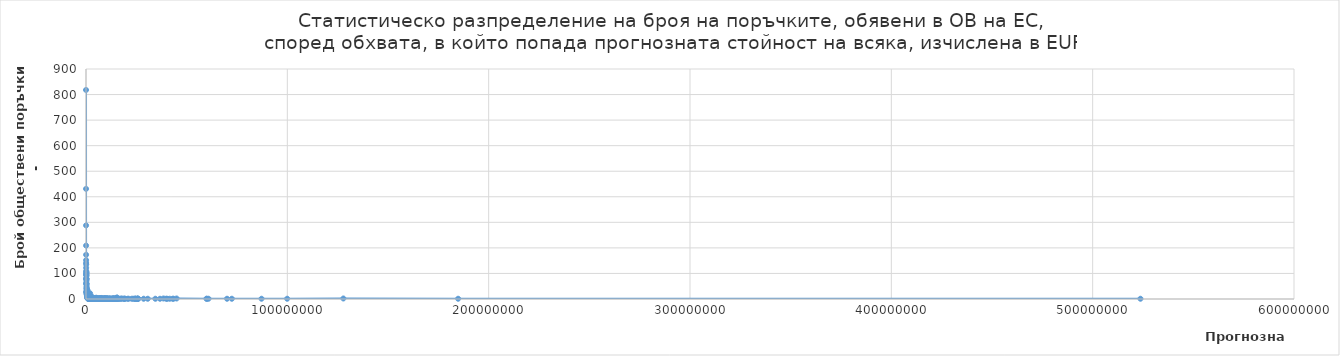
| Category | Series 0 |
|---|---|
| 10000.0 | 818 |
| 20000.0 | 431 |
| 30000.0 | 288 |
| 40000.0 | 209 |
| 50000.0 | 173 |
| 60000.0 | 152 |
| 70000.0 | 141 |
| 80000.0 | 122 |
| 90000.0 | 94 |
| 100000.0 | 110 |
| 110000.0 | 135 |
| 120000.0 | 62 |
| 130000.0 | 99 |
| 140000.0 | 81 |
| 150000.0 | 79 |
| 160000.0 | 104 |
| 170000.0 | 96 |
| 180000.0 | 61 |
| 190000.0 | 79 |
| 200000.0 | 71 |
| 210000.0 | 104 |
| 220000.0 | 59 |
| 230000.0 | 44 |
| 240000.0 | 77 |
| 250000.0 | 57 |
| 260000.0 | 91 |
| 270000.0 | 38 |
| 280000.0 | 32 |
| 290000.0 | 27 |
| 300000.0 | 19 |
| 310000.0 | 49 |
| 320000.0 | 28 |
| 330000.0 | 25 |
| 340000.0 | 27 |
| 350000.0 | 21 |
| 360000.0 | 28 |
| 370000.0 | 26 |
| 380000.0 | 27 |
| 390000.0 | 32 |
| 400000.0 | 25 |
| 410000.0 | 40 |
| 420000.0 | 23 |
| 430000.0 | 28 |
| 440000.0 | 27 |
| 450000.0 | 22 |
| 460000.0 | 13 |
| 470000.0 | 23 |
| 480000.0 | 11 |
| 490000.0 | 23 |
| 500000.0 | 20 |
| 510000.0 | 17 |
| 520000.0 | 32 |
| 530000.0 | 21 |
| 540000.0 | 25 |
| 550000.0 | 14 |
| 560000.0 | 11 |
| 570000.0 | 29 |
| 580000.0 | 10 |
| 590000.0 | 17 |
| 600000.0 | 10 |
| 610000.0 | 7 |
| 620000.0 | 20 |
| 630000.0 | 9 |
| 640000.0 | 22 |
| 650000.0 | 7 |
| 660000.0 | 8 |
| 670000.0 | 13 |
| 680000.0 | 9 |
| 690000.0 | 8 |
| 700000.0 | 11 |
| 710000.0 | 17 |
| 720000.0 | 10 |
| 730000.0 | 11 |
| 740000.0 | 3 |
| 750000.0 | 12 |
| 760000.0 | 8 |
| 770000.0 | 34 |
| 780000.0 | 6 |
| 790000.0 | 8 |
| 800000.0 | 14 |
| 810000.0 | 4 |
| 820000.0 | 7 |
| 830000.0 | 8 |
| 840000.0 | 10 |
| 850000.0 | 9 |
| 860000.0 | 9 |
| 870000.0 | 8 |
| 880000.0 | 4 |
| 890000.0 | 9 |
| 900000.0 | 8 |
| 910000.0 | 5 |
| 920000.0 | 1 |
| 930000.0 | 14 |
| 940000.0 | 7 |
| 950000.0 | 6 |
| 960000.0 | 3 |
| 970000.0 | 5 |
| 980000.0 | 9 |
| 990000.0 | 6 |
| 1000000.0 | 7 |
| 1010000.0 | 4 |
| 1020000.0 | 3 |
| 1030000.0 | 25 |
| 1040000.0 | 11 |
| 1060000.0 | 4 |
| 1070000.0 | 6 |
| 1080000.0 | 6 |
| 1090000.0 | 5 |
| 1100000.0 | 2 |
| 1110000.0 | 4 |
| 1120000.0 | 4 |
| 1130000.0 | 10 |
| 1140000.0 | 4 |
| 1150000.0 | 3 |
| 1160000.0 | 8 |
| 1180000.0 | 2 |
| 1190000.0 | 2 |
| 1200000.0 | 5 |
| 1210000.0 | 7 |
| 1220000.0 | 3 |
| 1230000.0 | 8 |
| 1240000.0 | 1 |
| 1250000.0 | 3 |
| 1260000.0 | 1 |
| 1270000.0 | 6 |
| 1280000.0 | 13 |
| 1290000.0 | 5 |
| 1300000.0 | 2 |
| 1310000.0 | 5 |
| 1330000.0 | 7 |
| 1340000.0 | 7 |
| 1350000.0 | 2 |
| 1360000.0 | 2 |
| 1370000.0 | 1 |
| 1390000.0 | 6 |
| 1400000.0 | 1 |
| 1410000.0 | 4 |
| 1420000.0 | 2 |
| 1430000.0 | 1 |
| 1440000.0 | 4 |
| 1450000.0 | 3 |
| 1460000.0 | 2 |
| 1470000.0 | 4 |
| 1480000.0 | 3 |
| 1490000.0 | 5 |
| 1500000.0 | 5 |
| 1510000.0 | 5 |
| 1520000.0 | 1 |
| 1540000.0 | 21 |
| 1560000.0 | 1 |
| 1570000.0 | 1 |
| 1580000.0 | 3 |
| 1590000.0 | 4 |
| 1600000.0 | 2 |
| 1610000.0 | 1 |
| 1630000.0 | 4 |
| 1640000.0 | 1 |
| 1650000.0 | 2 |
| 1660000.0 | 2 |
| 1670000.0 | 3 |
| 1680000.0 | 2 |
| 1690000.0 | 2 |
| 1700000.0 | 5 |
| 1710000.0 | 2 |
| 1720000.0 | 2 |
| 1730000.0 | 1 |
| 1740000.0 | 3 |
| 1750000.0 | 1 |
| 1760000.0 | 1 |
| 1770000.0 | 3 |
| 1780000.0 | 3 |
| 1790000.0 | 1 |
| 1800000.0 | 1 |
| 1810000.0 | 4 |
| 1820000.0 | 3 |
| 1830000.0 | 1 |
| 1840000.0 | 1 |
| 1850000.0 | 7 |
| 1860000.0 | 2 |
| 1880000.0 | 3 |
| 1890000.0 | 2 |
| 1900000.0 | 2 |
| 1910000.0 | 1 |
| 1920000.0 | 3 |
| 1940000.0 | 2 |
| 1950000.0 | 1 |
| 1970000.0 | 2 |
| 1980000.0 | 1 |
| 2000000.0 | 1 |
| 2010000.0 | 1 |
| 2020000.0 | 1 |
| 2030000.0 | 3 |
| 2040000.0 | 4 |
| 2050000.0 | 22 |
| 2060000.0 | 1 |
| 2070000.0 | 3 |
| 2080000.0 | 1 |
| 2090000.0 | 1 |
| 2100000.0 | 3 |
| 2110000.0 | 1 |
| 2120000.0 | 1 |
| 2130000.0 | 1 |
| 2140000.0 | 3 |
| 2150000.0 | 1 |
| 2160000.0 | 1 |
| 2170000.0 | 1 |
| 2180000.0 | 3 |
| 2190000.0 | 2 |
| 2200000.0 | 4 |
| 2210000.0 | 2 |
| 2220000.0 | 1 |
| 2240000.0 | 1 |
| 2250000.0 | 3 |
| 2260000.0 | 2 |
| 2280000.0 | 2 |
| 2290000.0 | 1 |
| 2300000.0 | 1 |
| 2310000.0 | 9 |
| 2320000.0 | 2 |
| 2340000.0 | 2 |
| 2360000.0 | 1 |
| 2380000.0 | 2 |
| 2390000.0 | 3 |
| 2400000.0 | 1 |
| 2410000.0 | 1 |
| 2420000.0 | 1 |
| 2430000.0 | 3 |
| 2460000.0 | 1 |
| 2470000.0 | 3 |
| 2490000.0 | 1 |
| 2500000.0 | 6 |
| 2510000.0 | 1 |
| 2540000.0 | 1 |
| 2560000.0 | 8 |
| 2570000.0 | 1 |
| 2580000.0 | 2 |
| 2590000.0 | 4 |
| 2600000.0 | 3 |
| 2610000.0 | 1 |
| 2620000.0 | 1 |
| 2660000.0 | 6 |
| 2670000.0 | 3 |
| 2690000.0 | 1 |
| 2700000.0 | 1 |
| 2710000.0 | 1 |
| 2750000.0 | 1 |
| 2770000.0 | 2 |
| 2790000.0 | 1 |
| 2820000.0 | 3 |
| 2830000.0 | 2 |
| 2840000.0 | 1 |
| 2850000.0 | 1 |
| 2860000.0 | 1 |
| 2870000.0 | 1 |
| 2900000.0 | 1 |
| 2910000.0 | 3 |
| 2920000.0 | 2 |
| 2930000.0 | 2 |
| 2960000.0 | 1 |
| 2970000.0 | 2 |
| 2980000.0 | 1 |
| 2990000.0 | 1 |
| 3010000.0 | 1 |
| 3020000.0 | 3 |
| 3070000.0 | 8 |
| 3080000.0 | 3 |
| 3110000.0 | 1 |
| 3140000.0 | 2 |
| 3150000.0 | 1 |
| 3160000.0 | 1 |
| 3170000.0 | 1 |
| 3180000.0 | 3 |
| 3210000.0 | 1 |
| 3220000.0 | 2 |
| 3230000.0 | 1 |
| 3240000.0 | 2 |
| 3250000.0 | 1 |
| 3260000.0 | 1 |
| 3280000.0 | 1 |
| 3290000.0 | 1 |
| 3300000.0 | 1 |
| 3320000.0 | 1 |
| 3330000.0 | 4 |
| 3380000.0 | 1 |
| 3390000.0 | 3 |
| 3400000.0 | 2 |
| 3410000.0 | 1 |
| 3420000.0 | 1 |
| 3440000.0 | 1 |
| 3470000.0 | 1 |
| 3480000.0 | 2 |
| 3490000.0 | 1 |
| 3510000.0 | 1 |
| 3520000.0 | 1 |
| 3530000.0 | 2 |
| 3560000.0 | 1 |
| 3570000.0 | 1 |
| 3580000.0 | 3 |
| 3600000.0 | 2 |
| 3640000.0 | 1 |
| 3690000.0 | 4 |
| 3720000.0 | 1 |
| 3740000.0 | 1 |
| 3760000.0 | 2 |
| 3800000.0 | 1 |
| 3820000.0 | 1 |
| 3840000.0 | 2 |
| 3860000.0 | 1 |
| 3870000.0 | 2 |
| 3900000.0 | 3 |
| 3910000.0 | 1 |
| 3920000.0 | 1 |
| 3950000.0 | 2 |
| 3960000.0 | 1 |
| 3980000.0 | 1 |
| 4000000.0 | 1 |
| 4040000.0 | 1 |
| 4060000.0 | 2 |
| 4090000.0 | 1 |
| 4100000.0 | 3 |
| 4120000.0 | 1 |
| 4130000.0 | 1 |
| 4140000.0 | 1 |
| 4160000.0 | 1 |
| 4170000.0 | 1 |
| 4180000.0 | 1 |
| 4200000.0 | 1 |
| 4210000.0 | 1 |
| 4220000.0 | 1 |
| 4230000.0 | 1 |
| 4270000.0 | 1 |
| 4280000.0 | 3 |
| 4320000.0 | 2 |
| 4330000.0 | 1 |
| 4350000.0 | 1 |
| 4370000.0 | 1 |
| 4390000.0 | 1 |
| 4410000.0 | 1 |
| 4480000.0 | 1 |
| 4490000.0 | 1 |
| 4500000.0 | 1 |
| 4510000.0 | 1 |
| 4610000.0 | 3 |
| 4640000.0 | 1 |
| 4650000.0 | 1 |
| 4660000.0 | 2 |
| 4670000.0 | 1 |
| 4680000.0 | 1 |
| 4690000.0 | 2 |
| 4700000.0 | 1 |
| 4740000.0 | 1 |
| 4760000.0 | 1 |
| 4820000.0 | 2 |
| 4850000.0 | 1 |
| 4860000.0 | 1 |
| 4890000.0 | 1 |
| 4930000.0 | 1 |
| 4950000.0 | 1 |
| 4960000.0 | 1 |
| 4990000.0 | 1 |
| 5010000.0 | 1 |
| 5050000.0 | 1 |
| 5120000.0 | 5 |
| 5250000.0 | 1 |
| 5320000.0 | 1 |
| 5370000.0 | 3 |
| 5450000.0 | 2 |
| 5490000.0 | 1 |
| 5530000.0 | 1 |
| 5670000.0 | 1 |
| 5700000.0 | 1 |
| 5730000.0 | 1 |
| 5740000.0 | 1 |
| 5760000.0 | 1 |
| 5790000.0 | 1 |
| 5970000.0 | 1 |
| 5990000.0 | 1 |
| 6040000.0 | 1 |
| 6140000.0 | 1 |
| 6240000.0 | 1 |
| 6400000.0 | 2 |
| 6410000.0 | 1 |
| 6620000.0 | 1 |
| 6650000.0 | 2 |
| 6660000.0 | 1 |
| 6740000.0 | 1 |
| 6760000.0 | 1 |
| 6790000.0 | 1 |
| 6910000.0 | 1 |
| 6960000.0 | 2 |
| 6970000.0 | 1 |
| 6980000.0 | 1 |
| 7070000.0 | 1 |
| 7160000.0 | 1 |
| 7230000.0 | 1 |
| 7300000.0 | 1 |
| 7370000.0 | 1 |
| 7410000.0 | 1 |
| 7550000.0 | 2 |
| 7560000.0 | 1 |
| 7570000.0 | 1 |
| 7590000.0 | 1 |
| 7620000.0 | 1 |
| 7670000.0 | 4 |
| 7680000.0 | 1 |
| 7740000.0 | 1 |
| 7780000.0 | 1 |
| 7940000.0 | 1 |
| 8160000.0 | 1 |
| 8200000.0 | 1 |
| 8210000.0 | 1 |
| 8460000.0 | 1 |
| 8670000.0 | 1 |
| 8780000.0 | 1 |
| 8910000.0 | 1 |
| 9050000.0 | 1 |
| 9110000.0 | 1 |
| 9120000.0 | 1 |
| 9130000.0 | 1 |
| 9170000.0 | 2 |
| 9210000.0 | 2 |
| 9240000.0 | 1 |
| 9320000.0 | 1 |
| 9370000.0 | 1 |
| 9460000.0 | 1 |
| 9470000.0 | 1 |
| 9480000.0 | 1 |
| 9540000.0 | 1 |
| 9720000.0 | 1 |
| 9790000.0 | 1 |
| 9830000.0 | 2 |
| 9910000.0 | 1 |
| 10230000.0 | 1 |
| 10280000.0 | 2 |
| 10310000.0 | 2 |
| 10340000.0 | 1 |
| 10490000.0 | 1 |
| 10540000.0 | 1 |
| 10770000.0 | 1 |
| 10810000.0 | 1 |
| 11220000.0 | 2 |
| 11400000.0 | 1 |
| 11560000.0 | 1 |
| 11640000.0 | 1 |
| 11650000.0 | 1 |
| 12170000.0 | 1 |
| 12290000.0 | 2 |
| 12390000.0 | 1 |
| 12790000.0 | 1 |
| 13210000.0 | 1 |
| 13280000.0 | 1 |
| 13300000.0 | 1 |
| 13320000.0 | 1 |
| 13480000.0 | 1 |
| 13540000.0 | 1 |
| 13570000.0 | 1 |
| 13690000.0 | 1 |
| 13760000.0 | 2 |
| 13800000.0 | 1 |
| 14240000.0 | 1 |
| 14310000.0 | 1 |
| 14320000.0 | 1 |
| 14350000.0 | 1 |
| 14380000.0 | 1 |
| 14650000.0 | 1 |
| 14710000.0 | 1 |
| 14770000.0 | 1 |
| 14950000.0 | 1 |
| 15050000.0 | 1 |
| 15060000.0 | 1 |
| 15320000.0 | 1 |
| 15340000.0 | 6 |
| 15390000.0 | 1 |
| 15410000.0 | 1 |
| 16010000.0 | 1 |
| 16020000.0 | 1 |
| 16390000.0 | 1 |
| 16990000.0 | 1 |
| 17490000.0 | 1 |
| 17790000.0 | 2 |
| 18760000.0 | 1 |
| 18880000.0 | 1 |
| 19180000.0 | 1 |
| 19470000.0 | 1 |
| 20680000.0 | 1 |
| 21150000.0 | 1 |
| 22690000.0 | 1 |
| 23420000.0 | 1 |
| 24100000.0 | 1 |
| 24430000.0 | 1 |
| 24550000.0 | 1 |
| 24730000.0 | 1 |
| 25400000.0 | 1 |
| 25570000.0 | 1 |
| 25630000.0 | 1 |
| 25640000.0 | 1 |
| 25770000.0 | 1 |
| 26050000.0 | 1 |
| 28640000.0 | 1 |
| 30680000.0 | 1 |
| 34450000.0 | 1 |
| 36760000.0 | 1 |
| 38490000.0 | 2 |
| 39840000.0 | 1 |
| 40260000.0 | 1 |
| 41570000.0 | 1 |
| 43030000.0 | 1 |
| 43460000.0 | 1 |
| 45000000.0 | 2 |
| 59830000.0 | 1 |
| 60010000.0 | 1 |
| 60850000.0 | 1 |
| 70050000.0 | 1 |
| 72440000.0 | 1 |
| 87180000.0 | 1 |
| 99920000.0 | 1 |
| 127830000.0 | 2 |
| 184830000.0 | 1 |
| 523740000.0 | 1 |